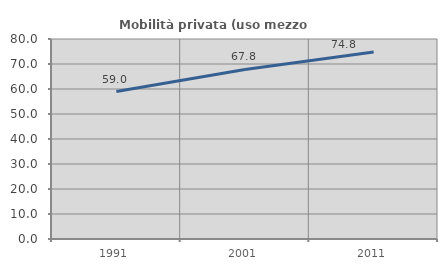
| Category | Mobilità privata (uso mezzo privato) |
|---|---|
| 1991.0 | 58.994 |
| 2001.0 | 67.828 |
| 2011.0 | 74.81 |